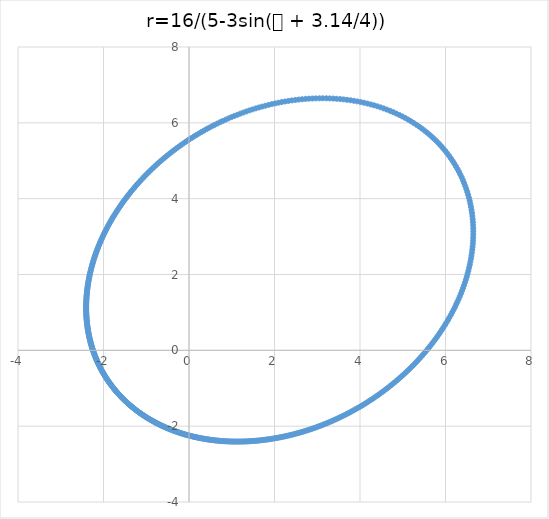
| Category | rcos𝜃 |
|---|---|
| 0.0 | 5.556 |
| 0.0559742580507268 | 5.597 |
| 0.112767491434925 | 5.638 |
| 0.170379171303371 | 5.678 |
| 0.228808205219521 | 5.717 |
| 0.288052913767401 | 5.756 |
| 0.348111006952672 | 5.795 |
| 0.40897956044187 | 5.833 |
| 0.470654991688498 | 5.871 |
| 0.533133035998396 | 5.908 |
| 0.596408722590663 | 5.944 |
| 0.66047635071428 | 5.98 |
| 0.725329465884532 | 6.015 |
| 0.790960836307244 | 6.05 |
| 0.857362429562832 | 6.084 |
| 0.924525389626059 | 6.117 |
| 0.992440014301314 | 6.15 |
| 1.061095733156989 | 6.181 |
| 1.130481086046299 | 6.212 |
| 1.200583702305423 | 6.243 |
| 1.271390280723322 | 6.272 |
| 1.342886570380751 | 6.3 |
| 1.415057352459082 | 6.328 |
| 1.48788642312219 | 6.355 |
| 1.561356577577191 | 6.38 |
| 1.635449595421861 | 6.405 |
| 1.710146227388313 | 6.429 |
| 1.785426183593811 | 6.451 |
| 1.861268123410462 | 6.473 |
| 1.937649647065853 | 6.493 |
| 2.014547289086554 | 6.512 |
| 2.09193651369561 | 6.531 |
| 2.169791712273822 | 6.548 |
| 2.248086202992553 | 6.563 |
| 2.326792232723158 | 6.578 |
| 2.405880981324683 | 6.591 |
| 2.485322568407387 | 6.603 |
| 2.565086062664724 | 6.613 |
| 2.645139493860741 | 6.623 |
| 2.725449867553441 | 6.63 |
| 2.805983182627347 | 6.637 |
| 2.886704451700478 | 6.642 |
| 2.967577724462106 | 6.645 |
| 3.048566113988016 | 6.647 |
| 3.1296318260696 | 6.648 |
| 3.210736191582004 | 6.647 |
| 3.291839701904661 | 6.644 |
| 3.372902047395103 | 6.64 |
| 3.453882158903792 | 6.634 |
| 3.534738252304055 | 6.627 |
| 3.615427875997072 | 6.618 |
| 3.69590796133729 | 6.607 |
| 3.776134875908732 | 6.595 |
| 3.856064479567582 | 6.581 |
| 3.935652183151072 | 6.566 |
| 4.014853009737483 | 6.548 |
| 4.0936216583267 | 6.529 |
| 4.171912569795808 | 6.509 |
| 4.24967999496931 | 6.486 |
| 4.326878064629325 | 6.462 |
| 4.403460861277121 | 6.437 |
| 4.479382492444324 | 6.409 |
| 4.554597165339605 | 6.38 |
| 4.629059262605193 | 6.349 |
| 4.70272341894701 | 6.316 |
| 4.775544598392825 | 6.282 |
| 4.847478171924623 | 6.246 |
| 4.918479995224446 | 6.208 |
| 4.988506486267515 | 6.169 |
| 5.057514702492326 | 6.128 |
| 5.125462417274915 | 6.085 |
| 5.192308195433537 | 6.041 |
| 5.258011467490632 | 5.995 |
| 5.32253260242128 | 5.948 |
| 5.385832978621258 | 5.898 |
| 5.447875052833393 | 5.848 |
| 5.508622426778082 | 5.796 |
| 5.568039911242645 | 5.742 |
| 5.626093587394479 | 5.687 |
| 5.68275086509469 | 5.631 |
| 5.737980538002126 | 5.573 |
| 5.791752835272084 | 5.514 |
| 5.844039469669685 | 5.453 |
| 5.894813681934523 | 5.391 |
| 5.944050281250963 | 5.328 |
| 5.991725681696843 | 5.264 |
| 6.03781793456253 | 5.198 |
| 6.082306756451943 | 5.131 |
| 6.125173553097254 | 5.064 |
| 6.166401438839161 | 4.995 |
| 6.205975251745152 | 4.925 |
| 6.243881564358289 | 4.854 |
| 6.280108690089252 | 4.782 |
| 6.31464668528402 | 4.709 |
| 6.347487347018728 | 4.636 |
| 6.37862420669189 | 4.561 |
| 6.408052519501895 | 4.486 |
| 6.435769249914687 | 4.41 |
| 6.461773053242424 | 4.334 |
| 6.486064253468906 | 4.257 |
| 6.508644817471242 | 4.179 |
| 6.529518325799788 | 4.101 |
| 6.548689940189712 | 4.022 |
| 6.566166367987489 | 3.943 |
| 6.581955823684254 | 3.864 |
| 6.596067987755291 | 3.784 |
| 6.608513963010859 | 3.703 |
| 6.619306228668096 | 3.623 |
| 6.628458592357128 | 3.542 |
| 6.635986140276358 | 3.461 |
| 6.641905185712715 | 3.381 |
| 6.646233216142091 | 3.299 |
| 6.648988839123558 | 3.218 |
| 6.650191727198226 | 3.137 |
| 6.649862561999789 | 3.056 |
| 6.648022977779146 | 2.975 |
| 6.644695504539795 | 2.894 |
| 6.639903510974432 | 2.814 |
| 6.633671147385954 | 2.733 |
| 6.626023288768433 | 2.653 |
| 6.616985478215325 | 2.573 |
| 6.606583870813397 | 2.493 |
| 6.594845178171843 | 2.413 |
| 6.581796613726511 | 2.334 |
| 6.567465838949693 | 2.255 |
| 6.551880910585946 | 2.177 |
| 6.535070229024761 | 2.099 |
| 6.517062487910822 | 2.022 |
| 6.497886625082959 | 1.945 |
| 6.477571774922978 | 1.868 |
| 6.456147222186223 | 1.792 |
| 6.433642357376147 | 1.717 |
| 6.410086633716255 | 1.642 |
| 6.385509525763844 | 1.568 |
| 6.359940489701554 | 1.494 |
| 6.333408925334547 | 1.422 |
| 6.305944139813447 | 1.349 |
| 6.277575313095676 | 1.278 |
| 6.248331465151017 | 1.207 |
| 6.218241424910537 | 1.137 |
| 6.187333800952016 | 1.067 |
| 6.155636953909229 | 0.998 |
| 6.12317897058729 | 0.93 |
| 6.08998763976131 | 0.863 |
| 6.056090429631358 | 0.797 |
| 6.021514466902601 | 0.731 |
| 5.986286517456012 | 0.666 |
| 5.950432968571779 | 0.602 |
| 5.91397981266483 | 0.538 |
| 5.87695263248933 | 0.476 |
| 5.839376587767073 | 0.414 |
| 5.801276403192772 | 0.353 |
| 5.762676357768006 | 0.293 |
| 5.723600275414252 | 0.234 |
| 5.684071516814773 | 0.175 |
| 5.644112972434353 | 0.117 |
| 5.603747056665756 | 0.061 |
| 5.562995703051408 | 0.004 |
| 5.521880360529158 | -0.051 |
| 5.480421990651032 | -0.105 |
| 5.43864106572458 | -0.159 |
| 5.396557567826798 | -0.212 |
| 5.354190988641602 | -0.264 |
| 5.311560330072552 | -0.315 |
| 5.268684105583616 | -0.365 |
| 5.225580342221822 | -0.415 |
| 5.182266583276881 | -0.464 |
| 5.13875989153406 | -0.511 |
| 5.095076853077968 | -0.559 |
| 5.051233581606212 | -0.605 |
| 5.00724572321341 | -0.651 |
| 4.963128461607324 | -0.695 |
| 4.918896523720498 | -0.739 |
| 4.874564185682143 | -0.783 |
| 4.830145279116567 | -0.825 |
| 4.785653197735847 | -0.867 |
| 4.741100904196051 | -0.908 |
| 4.696500937187559 | -0.948 |
| 4.651865418731734 | -0.988 |
| 4.607206061657382 | -1.026 |
| 4.562534177231989 | -1.064 |
| 4.517860682924014 | -1.102 |
| 4.47319611027389 | -1.138 |
| 4.42855061285262 | -1.174 |
| 4.383933974288251 | -1.21 |
| 4.339355616341526 | -1.244 |
| 4.294824607013456 | -1.278 |
| 4.250349668668438 | -1.311 |
| 4.205939186157877 | -1.344 |
| 4.161601214930151 | -1.375 |
| 4.11734348911392 | -1.407 |
| 4.073173429562632 | -1.437 |
| 4.029098151849145 | -1.467 |
| 3.985124474200153 | -1.496 |
| 3.941258925361031 | -1.525 |
| 3.89750775238254 | -1.553 |
| 3.853876928321523 | -1.581 |
| 3.81037215984855 | -1.607 |
| 3.766998894756103 | -1.634 |
| 3.723762329361566 | -1.659 |
| 3.680667415799935 | -1.684 |
| 3.637718869201685 | -1.709 |
| 3.59492117475187 | -1.733 |
| 3.552278594626954 | -1.756 |
| 3.509795174806459 | -1.779 |
| 3.467474751756877 | -1.802 |
| 3.425320958985806 | -1.824 |
| 3.383337233464593 | -1.845 |
| 3.341526821918219 | -1.866 |
| 3.299892786981428 | -1.886 |
| 3.258438013220481 | -1.906 |
| 3.217165213020199 | -1.925 |
| 3.176076932336219 | -1.944 |
| 3.135175556312667 | -1.962 |
| 3.094463314765663 | -1.98 |
| 3.053942287533321 | -1.997 |
| 3.013614409693058 | -2.014 |
| 2.97348147664725 | -2.031 |
| 2.93354514907842 | -2.047 |
| 2.893806957775282 | -2.062 |
| 2.854268308331105 | -2.078 |
| 2.814930485716014 | -2.092 |
| 2.775794658724882 | -2.107 |
| 2.736861884302644 | -2.121 |
| 2.698133111748879 | -2.134 |
| 2.659609186803645 | -2.147 |
| 2.621290855616545 | -2.16 |
| 2.583178768601132 | -2.172 |
| 2.545273484176742 | -2.184 |
| 2.507575472399936 | -2.196 |
| 2.470085118487725 | -2.207 |
| 2.432802726234794 | -2.218 |
| 2.39572852132696 | -2.228 |
| 2.358862654553114 | -2.238 |
| 2.322205204917882 | -2.248 |
| 2.285756182657279 | -2.258 |
| 2.249515532159588 | -2.267 |
| 2.213483134793731 | -2.275 |
| 2.177658811647341 | -2.284 |
| 2.142042326176777 | -2.292 |
| 2.106633386771277 | -2.3 |
| 2.071431649233429 | -2.307 |
| 2.036436719178127 | -2.314 |
| 2.001648154352154 | -2.321 |
| 1.967065466876477 | -2.328 |
| 1.932688125413376 | -2.334 |
| 1.898515557260411 | -2.34 |
| 1.864547150373286 | -2.346 |
| 1.830782255319569 | -2.351 |
| 1.797220187165231 | -2.356 |
| 1.763860227295924 | -2.361 |
| 1.730701625174866 | -2.366 |
| 1.697743600039193 | -2.37 |
| 1.664985342536571 | -2.374 |
| 1.632426016303853 | -2.378 |
| 1.600064759489503 | -2.382 |
| 1.567900686221483 | -2.385 |
| 1.535932888022268 | -2.388 |
| 1.504160435172603 | -2.391 |
| 1.47258237802558 | -2.393 |
| 1.441197748272591 | -2.396 |
| 1.410005560162651 | -2.398 |
| 1.379004811676569 | -2.4 |
| 1.348194485657397 | -2.401 |
| 1.317573550898557 | -2.403 |
| 1.287140963191002 | -2.404 |
| 1.256895666330736 | -2.405 |
| 1.226836593087992 | -2.406 |
| 1.196962666139306 | -2.406 |
| 1.167272798963733 | -2.407 |
| 1.137765896704368 | -2.407 |
| 1.108440856996341 | -2.407 |
| 1.079296570762408 | -2.407 |
| 1.05033192297723 | -2.406 |
| 1.021545793401381 | -2.405 |
| 0.992937057286158 | -2.405 |
| 0.964504586050133 | -2.404 |
| 0.936247247928476 | -2.403 |
| 0.90816390859595 | -2.401 |
| 0.880253431764505 | -2.4 |
| 0.852514679756369 | -2.398 |
| 0.824946514053478 | -2.396 |
| 0.797547795824084 | -2.394 |
| 0.770317386427363 | -2.392 |
| 0.743254147896785 | -2.389 |
| 0.716356943403026 | -2.387 |
| 0.68962463769714 | -2.384 |
| 0.663056097534725 | -2.381 |
| 0.63665019208175 | -2.378 |
| 0.610405793302736 | -2.375 |
| 0.584321776331926 | -2.371 |
| 0.558397019828067 | -2.368 |
| 0.532630406313429 | -2.364 |
| 0.507020822497637 | -2.36 |
| 0.481567159586883 | -2.356 |
| 0.456268313579081 | -2.352 |
| 0.431123185545489 | -2.348 |
| 0.406130681899321 | -2.344 |
| 0.381289714651837 | -2.339 |
| 0.356599201656411 | -2.334 |
| 0.332058066841033 | -2.329 |
| 0.307665240429696 | -2.325 |
| 0.283419659153116 | -2.319 |
| 0.259320266449191 | -2.314 |
| 0.235366012653632 | -2.309 |
| 0.211555855181137 | -2.303 |
| 0.187888758697503 | -2.298 |
| 0.164363695283049 | -2.292 |
| 0.140979644587695 | -2.286 |
| 0.117735593978055 | -2.28 |
| 0.0946305386768722 | -2.274 |
| 0.0716634818951167 | -2.268 |
| 0.0488334349570664 | -2.261 |
| 0.0261394174186626 | -2.255 |
| 0.00358045717943937 | -2.248 |
| -0.0188444094116951 | -2.241 |
| -0.0411361374565514 | -2.235 |
| -0.0632956734133636 | -2.228 |
| -0.0853239550078507 | -2.22 |
| -0.10722191114939 | -2.213 |
| -0.128990461852063 | -2.206 |
| -0.150630518160346 | -2.199 |
| -0.172142982079224 | -2.191 |
| -0.193528746508506 | -2.183 |
| -0.214788695181153 | -2.176 |
| -0.23592370260539 | -2.168 |
| -0.256934634010436 | -2.16 |
| -0.277822345295648 | -2.152 |
| -0.298587682982905 | -2.144 |
| -0.31923148417205 | -2.135 |
| -0.339754576499234 | -2.127 |
| -0.360157778097979 | -2.118 |
| -0.380441897562826 | -2.11 |
| -0.400607733915389 | -2.101 |
| -0.420656076572691 | -2.092 |
| -0.440587705317618 | -2.083 |
| -0.460403390271373 | -2.074 |
| -0.480103891867774 | -2.065 |
| -0.499689960829287 | -2.056 |
| -0.519162338144655 | -2.047 |
| -0.538521755048008 | -2.037 |
| -0.557768932999327 | -2.028 |
| -0.57690458366617 | -2.018 |
| -0.595929408906519 | -2.009 |
| -0.614844100752665 | -1.999 |
| -0.633649341396022 | -1.989 |
| -0.652345803172759 | -1.979 |
| -0.670934148550168 | -1.969 |
| -0.689415030113659 | -1.959 |
| -0.707789090554306 | -1.949 |
| -0.726056962656838 | -1.938 |
| -0.744219269288001 | -1.928 |
| -0.762276623385202 | -1.917 |
| -0.780229627945356 | -1.907 |
| -0.798078876013856 | -1.896 |
| -0.81582495067358 | -1.885 |
| -0.833468425033878 | -1.874 |
| -0.851009862219452 | -1.863 |
| -0.868449815359059 | -1.852 |
| -0.885788827573976 | -1.841 |
| -0.903027431966146 | -1.83 |
| -0.920166151605953 | -1.819 |
| -0.937205499519557 | -1.807 |
| -0.954145978675713 | -1.796 |
| -0.97098808197204 | -1.784 |
| -0.987732292220647 | -1.772 |
| -1.004379082133089 | -1.761 |
| -1.020928914304566 | -1.749 |
| -1.037382241197333 | -1.737 |
| -1.053739505123255 | -1.725 |
| -1.070001138225438 | -1.713 |
| -1.08616756245892 | -1.701 |
| -1.102239189570323 | -1.688 |
| -1.118216421076459 | -1.676 |
| -1.134099648241797 | -1.663 |
| -1.149889252054782 | -1.651 |
| -1.165585603202915 | -1.638 |
| -1.181189062046582 | -1.625 |
| -1.196699978591561 | -1.613 |
| -1.212118692460164 | -1.6 |
| -1.227445532860969 | -1.587 |
| -1.242680818557094 | -1.574 |
| -1.25782485783297 | -1.561 |
| -1.272877948459557 | -1.547 |
| -1.287840377657968 | -1.534 |
| -1.302712422061447 | -1.521 |
| -1.317494347675662 | -1.507 |
| -1.33218640983726 | -1.493 |
| -1.346788853170654 | -1.48 |
| -1.361301911542968 | -1.466 |
| -1.375725808017135 | -1.452 |
| -1.390060754803063 | -1.438 |
| -1.404306953206855 | -1.424 |
| -1.418464593578015 | -1.41 |
| -1.432533855254616 | -1.396 |
| -1.446514906506364 | -1.381 |
| -1.460407904475526 | -1.367 |
| -1.474212995115677 | -1.353 |
| -1.487930313128208 | -1.338 |
| -1.501559981896564 | -1.323 |
| -1.515102113418155 | -1.309 |
| -1.528556808233897 | -1.294 |
| -1.541924155355334 | -1.279 |
| -1.555204232189306 | -1.264 |
| -1.568397104460091 | -1.249 |
| -1.581502826128994 | -1.233 |
| -1.59452143931133 | -1.218 |
| -1.607452974190741 | -1.203 |
| -1.620297448930815 | -1.187 |
| -1.633054869583938 | -1.172 |
| -1.64572522999735 | -1.156 |
| -1.65830851171633 | -1.14 |
| -1.670804683884474 | -1.124 |
| -1.683213703141017 | -1.109 |
| -1.695535513515129 | -1.093 |
| -1.707770046317143 | -1.076 |
| -1.719917220026663 | -1.06 |
| -1.731976940177489 | -1.044 |
| -1.743949099239308 | -1.027 |
| -1.755833576496094 | -1.011 |
| -1.767630237921156 | -0.994 |
| -1.77933893604878 | -0.978 |
| -1.79095950984241 | -0.961 |
| -1.802491784559294 | -0.944 |
| -1.813935571611551 | -0.927 |
| -1.82529066842359 | -0.91 |
| -1.83655685828581 | -0.893 |
| -1.847733910204542 | -0.875 |
| -1.858821578748139 | -0.858 |
| -1.869819603889175 | -0.84 |
| -1.880727710842664 | -0.823 |
| -1.891545609900261 | -0.805 |
| -1.902272996260343 | -0.787 |
| -1.912909549853927 | -0.769 |
| -1.923454935166346 | -0.751 |
| -1.933908801054618 | -0.733 |
| -1.944270780560416 | -0.715 |
| -1.954540490718602 | -0.697 |
| -1.964717532361217 | -0.678 |
| -1.97480148991687 | -0.66 |
| -1.984791931205448 | -0.641 |
| -1.994688407228075 | -0.622 |
| -2.004490451952224 | -0.603 |
| -2.014197582091925 | -0.584 |
| -2.023809296882984 | -0.565 |
| -2.033325077853115 | -0.546 |
| -2.042744388586933 | -0.527 |
| -2.052066674485705 | -0.507 |
| -2.061291362521772 | -0.488 |
| -2.070417860987581 | -0.468 |
| -2.079445559239216 | -0.448 |
| -2.088373827434356 | -0.429 |
| -2.097202016264578 | -0.409 |
| -2.105929456681892 | -0.388 |
| -2.114555459619453 | -0.368 |
| -2.12307931570634 | -0.348 |
| -2.13150029497631 | -0.327 |
| -2.139817646570445 | -0.307 |
| -2.148030598433606 | -0.286 |
| -2.156138357004583 | -0.265 |
| -2.164140106899863 | -0.244 |
| -2.172035010590922 | -0.223 |
| -2.179822208074938 | -0.202 |
| -2.187500816538848 | -0.181 |
| -2.19506993001663 | -0.159 |
| -2.202528619039747 | -0.138 |
| -2.209875930280625 | -0.116 |
| -2.217110886189097 | -0.094 |
| -2.224232484621711 | -0.072 |
| -2.231239698463791 | -0.05 |
| -2.238131475244187 | -0.028 |
| -2.244906736742596 | -0.005 |
| -2.251564378589367 | 0.017 |
| -2.258103269857709 | 0.04 |
| -2.264522252648188 | 0.063 |
| -2.27082014166545 | 0.085 |
| -2.276995723787049 | 0.108 |
| -2.283047757624322 | 0.132 |
| -2.288974973075204 | 0.155 |
| -2.294776070868902 | 0.178 |
| -2.300449722102351 | 0.202 |
| -2.305994567768364 | 0.226 |
| -2.311409218275398 | 0.25 |
| -2.316692252958865 | 0.274 |
| -2.321842219583904 | 0.298 |
| -2.326857633839557 | 0.322 |
| -2.331736978824269 | 0.347 |
| -2.336478704522659 | 0.371 |
| -2.341081227273495 | 0.396 |
| -2.345542929228825 | 0.421 |
| -2.349862157804203 | 0.446 |
| -2.354037225119986 | 0.471 |
| -2.358066407433635 | 0.497 |
| -2.361947944563007 | 0.522 |
| -2.365680039300606 | 0.548 |
| -2.369260856818772 | 0.574 |
| -2.372688524065785 | 0.6 |
| -2.375961129152904 | 0.626 |
| -2.379076720732323 | 0.652 |
| -2.382033307366058 | 0.679 |
| -2.384828856885809 | 0.705 |
| -2.387461295743793 | 0.732 |
| -2.389928508354636 | 0.759 |
| -2.392228336428344 | 0.786 |
| -2.394358578294432 | 0.814 |
| -2.396316988217307 | 0.841 |
| -2.398101275702978 | 0.869 |
| -2.399709104797218 | 0.897 |
| -2.401138093375304 | 0.925 |
| -2.402385812423467 | 0.953 |
| -2.403449785312233 | 0.981 |
| -2.404327487061811 | 1.01 |
| -2.405016343599752 | 1.038 |
| -2.405513731011085 | 1.067 |
| -2.405816974781175 | 1.096 |
| -2.405923349031576 | 1.126 |
| -2.405830075749175 | 1.155 |
| -2.405534324008928 | 1.185 |
| -2.405033209190556 | 1.214 |
| -2.404323792189558 | 1.244 |
| -2.403403078622968 | 1.275 |
| -2.402268018030272 | 1.305 |
| -2.400915503069976 | 1.335 |
| -2.39934236871233 | 1.366 |
| -2.39754539142875 | 1.397 |
| -2.395521288378531 | 1.428 |
| -2.393266716593474 | 1.459 |
| -2.390778272161112 | 1.491 |
| -2.388052489407239 | 1.523 |
| -2.385085840078518 | 1.555 |
| -2.381874732525988 | 1.587 |
| -2.378415510890331 | 1.619 |
| -2.374704454289849 | 1.651 |
| -2.370737776012106 | 1.684 |
| -2.366511622710309 | 1.717 |
| -2.362022073605527 | 1.75 |
| -2.357265139695931 | 1.783 |
| -2.352236762974297 | 1.817 |
| -2.346932815655109 | 1.85 |
| -2.341349099412641 | 1.884 |
| -2.335481344631517 | 1.918 |
| -2.329325209671303 | 1.952 |
| -2.322876280146771 | 1.987 |
| -2.316130068225604 | 2.022 |
| -2.309082011945339 | 2.057 |
| -2.301727474551527 | 2.092 |
| -2.294061743859109 | 2.127 |
| -2.286080031639176 | 2.162 |
| -2.277777473033366 | 2.198 |
| -2.26914912599826 | 2.234 |
| -2.260189970782285 | 2.27 |
| -2.250894909437726 | 2.307 |
| -2.241258765370611 | 2.343 |
| -2.231276282931341 | 2.38 |
| -2.220942127049078 | 2.417 |
| -2.210250882913087 | 2.454 |
| -2.199197055704307 | 2.491 |
| -2.187775070380657 | 2.529 |
| -2.175979271519689 | 2.567 |
| -2.16380392322238 | 2.605 |
| -2.15124320908204 | 2.643 |
| -2.138291232222476 | 2.681 |
| -2.124942015409719 | 2.72 |
| -2.111189501241837 | 2.759 |
| -2.097027552421533 | 2.798 |
| -2.082449952116407 | 2.837 |
| -2.067450404411999 | 2.877 |
| -2.052022534862908 | 2.916 |
| -2.036159891147496 | 2.956 |
| -2.019855943831918 | 2.996 |
| -2.003104087249415 | 3.036 |
| -1.985897640501067 | 3.077 |
| -1.968229848584386 | 3.117 |
| -1.950093883656399 | 3.158 |
| -1.93148284643809 | 3.199 |
| -1.912389767767312 | 3.24 |
| -1.892807610307508 | 3.282 |
| -1.872729270419853 | 3.323 |
| -1.852147580206631 | 3.365 |
| -1.831055309733943 | 3.407 |
| -1.809445169442067 | 3.449 |
| -1.787309812752027 | 3.491 |
| -1.764641838877192 | 3.533 |
| -1.741433795848944 | 3.576 |
| -1.717678183765702 | 3.619 |
| -1.693367458274797 | 3.661 |
| -1.668494034296962 | 3.704 |
| -1.643050290003352 | 3.748 |
| -1.617028571055277 | 3.791 |
| -1.590421195116983 | 3.834 |
| -1.56322045665203 | 3.878 |
| -1.535418632013967 | 3.922 |
| -1.507007984842154 | 3.965 |
| -1.477980771773753 | 4.009 |
| -1.448329248482958 | 4.053 |
| -1.41804567605871 | 4.097 |
| -1.38712232773212 | 4.142 |
| -1.355551495964957 | 4.186 |
| -1.32332549991047 | 4.23 |
| -1.290436693257875 | 4.275 |
| -1.256877472471711 | 4.319 |
| -1.222640285437204 | 4.364 |
| -1.187717640522619 | 4.408 |
| -1.15210211606939 | 4.453 |
| -1.115786370320582 | 4.497 |
| -1.078763151797914 | 4.542 |
| -1.041025310137267 | 4.587 |
| -1.002565807392128 | 4.631 |
| -0.963377729813968 | 4.676 |
| -0.923454300117985 | 4.721 |
| -0.882788890242019 | 4.765 |
| -0.841375034605718 | 4.81 |
| -0.79920644387624 | 4.854 |
| -0.756277019245919 | 4.898 |
| -0.712580867226288 | 4.943 |
| -0.668112314961822 | 4.987 |
| -0.622865926065561 | 5.031 |
| -0.576836516977478 | 5.075 |
| -0.530019173845074 | 5.118 |
| -0.482409269924149 | 5.162 |
| -0.434002483496069 | 5.205 |
| -0.38479481629609 | 5.248 |
| -0.334782612445411 | 5.291 |
| -0.283962577877614 | 5.334 |
| -0.232331800247995 | 5.377 |
| -0.179887769312024 | 5.419 |
| -0.126628397756741 | 5.461 |
| -0.0725520424663441 | 5.502 |
| -0.0176575262005417 | 5.543 |